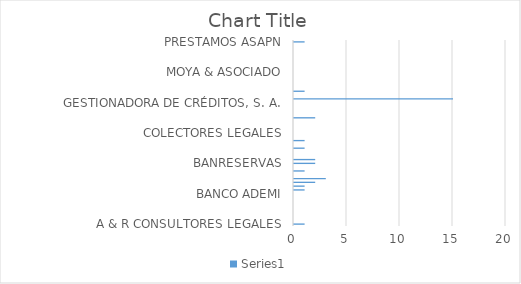
| Category | Series 0 |
|---|---|
| A & R CONSULTORES LEGALES | 1 |
| ALCANTARA BERAS & ASOCIADOS | 0 |
| ALTICE DOMINICANA, S.A. | 0 |
| ASC. POPULAR DE AHORROS Y PRESTAMOS | 0 |
| ASEREMIN | 0 |
| ATEGIX COBROS LEGALES, S.R.L | 0 |
| AYUNTAMIENTO DEL DISTRITO NACIONAL, ADN | 0 |
| BALLISTA CONTRERAS & ASOCIADO | 0 |
| BANCO ADEMI | 0 |
| BANCO BHD LEON | 1 |
| BANCO CARIBE | 1 |
| BANCO POPULAR DOMINICANO | 2 |
| BANCO PROMERICA | 3 |
| BANCO SANTA CRUZ | 0 |
| BANCO UNION | 1 |
| BANESCO | 0 |
| BANRESERVAS | 2 |
| BAUGIL INVERSIONES Y PRÉSTAMOS, S.R.L. | 2 |
| CABRAL & DIAZ ASESORES LEGALES | 0 |
| CHAMI ISA OFICINA DE ABOGADOS | 0 |
| CLARO COMPANIA DOMINICANA DE TELEFONOS | 1 |
| COBEX. S.R.L. | 0 |
| COBROS LEGALES PEGUERO MATEO | 1 |
| COBROS NACIONALES | 0 |
| COLECTORES LEGALES | 0 |
| COOP-ASPIRE | 0 |
| CORPORACION DE CREDITO REIDCO | 0 |
| ESTUDIO LEGAL SOSA EVERTZ | 0 |
| FBGG SERVICIOS LEGALES | 2 |
| FINANCE GALLERY | 0 |
| FINANCIERA CREDICEFI | 0 |
| GESTIONADORA DE CREDITOS NOVANET | 0 |
| GESTIONADORA DE CRÉDITOS, S. A. | 0 |
| GESTIONES DE COBROS CORNIEL HEINSEN Y ASOC. SRL | 15 |
| GESTORA DE COBROS GUERRERO GIL Y ASOCIADOS | 0 |
| GUERRERO GIL Y ASOCIADOS | 1 |
| INVERSIONES 3R | 0 |
| INVERSIONES CROUSET | 0 |
| JULIÁN BRENES Y ASOCIADOS | 0 |
| L & R COMERCIAL SRL | 0 |
| MOYA & ASOCIADO | 0 |
| NO DEFINIDA | 0 |
| OFICINA DE ABOGADOS SOLUCIONES CARVAC | 0 |
| OLIVERO RODRIGUEZ Y ASOCIADOS | 0 |
| OTROS | 0 |
| PAREDES CUEVAS & ASOCIADOS | 0 |
| PC&N ACCESO LEGAL | 0 |
| PLUS LEGAL, S.R.L. | 0 |
| PRESTAMOS ASAPN | 1 |